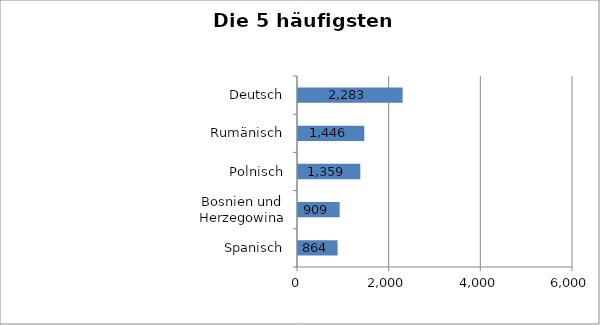
| Category | Series 0 |
|---|---|
| Spanisch | 864 |
| Bosnien und Herzegowina | 909 |
| Polnisch | 1359 |
| Rumänisch | 1446 |
| Deutsch | 2283 |